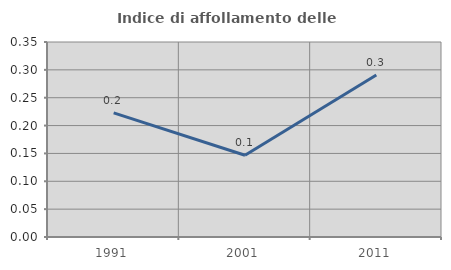
| Category | Indice di affollamento delle abitazioni  |
|---|---|
| 1991.0 | 0.223 |
| 2001.0 | 0.147 |
| 2011.0 | 0.291 |